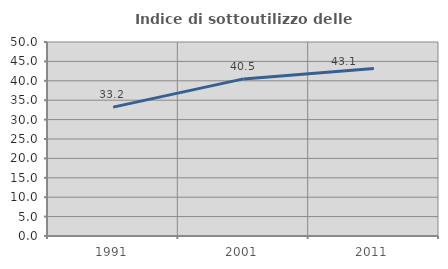
| Category | Indice di sottoutilizzo delle abitazioni  |
|---|---|
| 1991.0 | 33.21 |
| 2001.0 | 40.492 |
| 2011.0 | 43.148 |